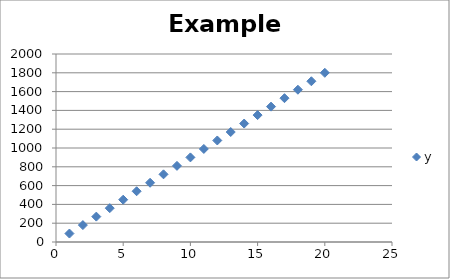
| Category | y |
|---|---|
| 1.0 | 90 |
| 2.0 | 180 |
| 3.0 | 270 |
| 4.0 | 360 |
| 5.0 | 450 |
| 6.0 | 540 |
| 7.0 | 630 |
| 8.0 | 720 |
| 9.0 | 810 |
| 10.0 | 900 |
| 11.0 | 990 |
| 12.0 | 1080 |
| 13.0 | 1170 |
| 14.0 | 1260 |
| 15.0 | 1350 |
| 16.0 | 1440 |
| 17.0 | 1530 |
| 18.0 | 1620 |
| 19.0 | 1710 |
| 20.0 | 1800 |